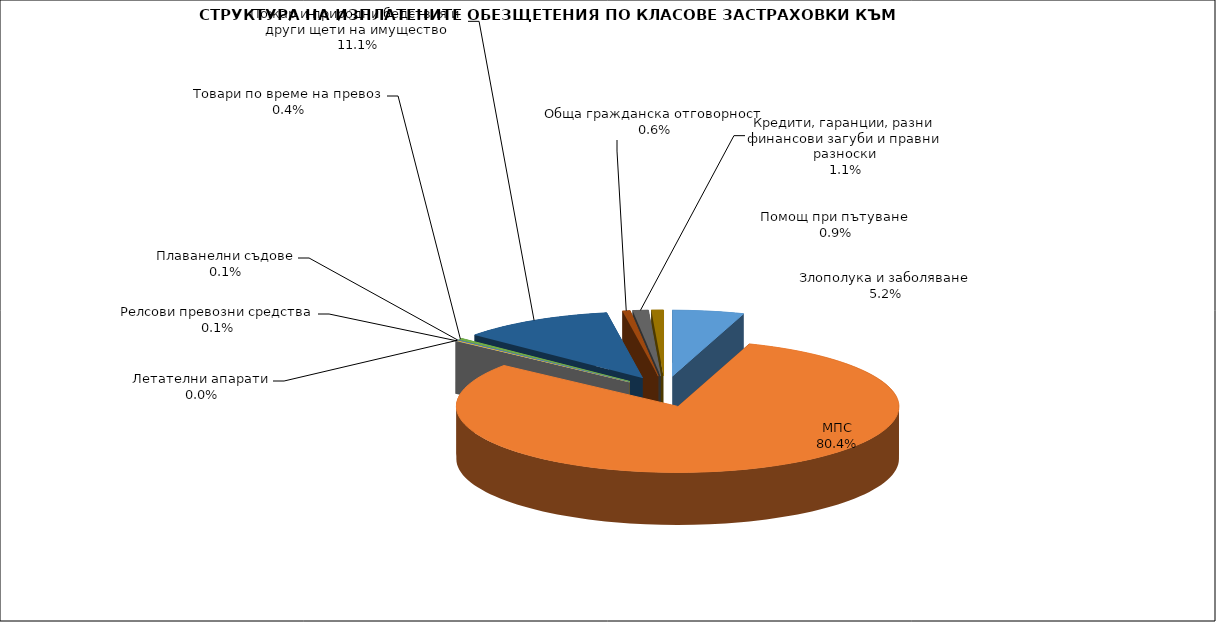
| Category | Series 0 |
|---|---|
| Злополука и заболяване | 0.052 |
| МПС | 0.804 |
| Релсови превозни средства | 0.001 |
| Летателни апарати | 0 |
| Плаванелни съдове | 0.001 |
| Товари по време на превоз | 0.004 |
| Пожар и природни бедствия и други щети на имущество | 0.111 |
| Обща гражданска отговорност | 0.006 |
| Кредити, гаранции, разни финансови загуби и правни разноски | 0.011 |
| Помощ при пътуване | 0.009 |